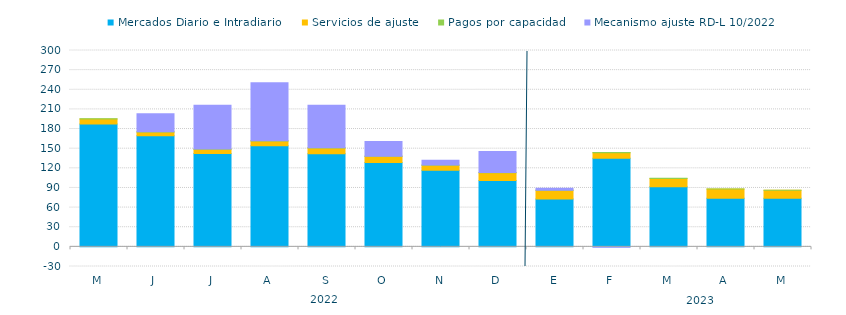
| Category | Mercados Diario e Intradiario  | Servicios de ajuste | Pagos por capacidad | Mecanismo ajuste RD-L 10/2022 |
|---|---|---|---|---|
| M | 187.7 | 7.82 | 0.23 | 0 |
| J | 169.63 | 5.85 | 0.25 | 27.54 |
| J | 142.79 | 6.39 | 0.44 | 66.88 |
| A | 154.49 | 7.22 | 0.26 | 88.84 |
| S | 142.08 | 8.94 | 0.26 | 64.95 |
| O | 128.7 | 9.63 | 0.21 | 22.46 |
| N | 117.18 | 7.52 | 0.31 | 7.14 |
| D | 101.21 | 12 | 0.43 | 32.09 |
| E | 73.11 | 13.21 | 0.34 | 2.9 |
| F | 135.43 | 8.36 | 0.35 | -0.72 |
| M | 91.9 | 12.55 | 0.24 | 0 |
| A | 74.42 | 13.82 | 0.17 | 0 |
| M | 74.42 | 11.93 | 0.17 | 0 |